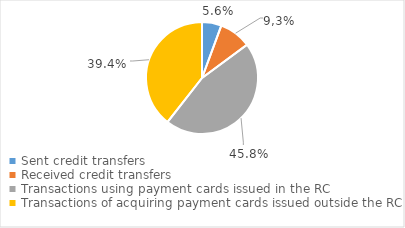
| Category | Series 0 |
|---|---|
| Sent credit transfers | 4133350 |
| Received credit transfers | 6792809 |
| Transactions using payment cards issued in the RC | 33622169 |
| Transactions of acquiring payment cards issued outside the RC | 28987047 |